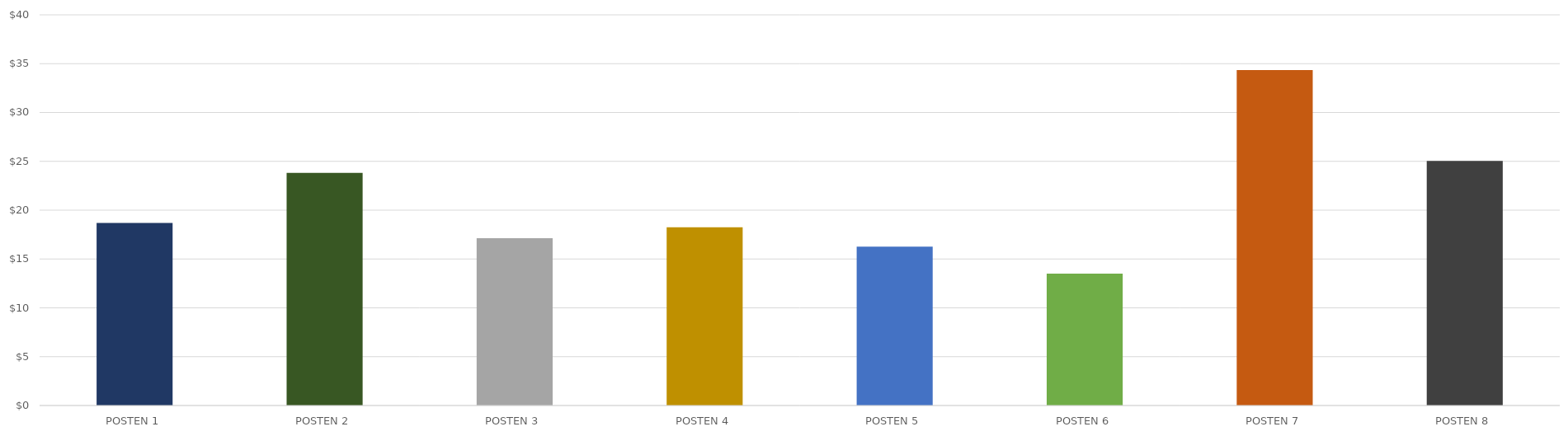
| Category | GEWINN PRO ELEMENT |
|---|---|
| POSTEN 1 | 18.685 |
| POSTEN 2 | 23.815 |
| POSTEN 3 | 17.125 |
| POSTEN 4 | 18.25 |
| POSTEN 5 | 16.275 |
| POSTEN 6 | 13.5 |
| POSTEN 7 | 34.35 |
| POSTEN 8 | 25.04 |